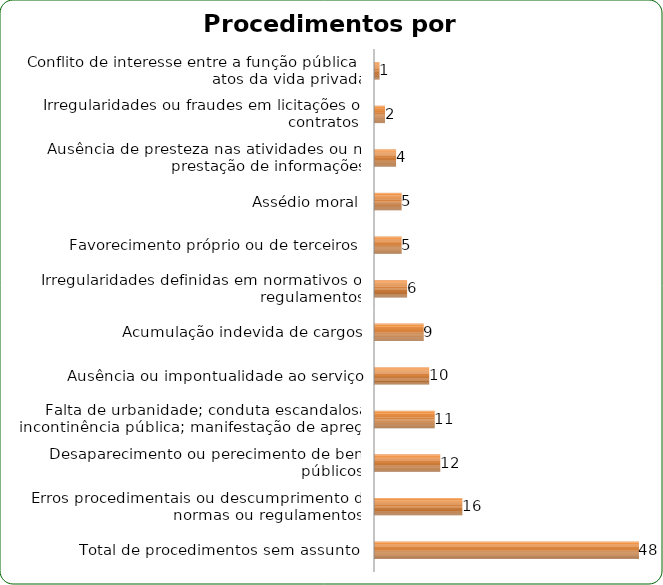
| Category | Series 0 |
|---|---|
| Total de procedimentos sem assunto  | 48 |
| Erros procedimentais ou descumprimento de normas ou regulamentos  | 16 |
| Desaparecimento ou perecimento de bens públicos | 12 |
| Falta de urbanidade; conduta escandalosa; incontinência pública; manifestação de apreço | 11 |
| Ausência ou impontualidade ao serviço | 10 |
| Acumulação indevida de cargos | 9 |
| Irregularidades definidas em normativos ou regulamentos | 6 |
| Favorecimento próprio ou de terceiros  | 5 |
| Assédio moral | 5 |
| Ausência de presteza nas atividades ou na prestação de informações | 4 |
| Irregularidades ou fraudes em licitações ou contratos  | 2 |
| Conflito de interesse entre a função pública e atos da vida privada | 1 |